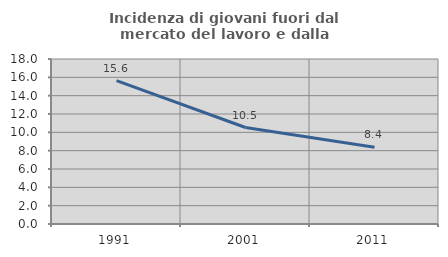
| Category | Incidenza di giovani fuori dal mercato del lavoro e dalla formazione  |
|---|---|
| 1991.0 | 15.634 |
| 2001.0 | 10.526 |
| 2011.0 | 8.378 |